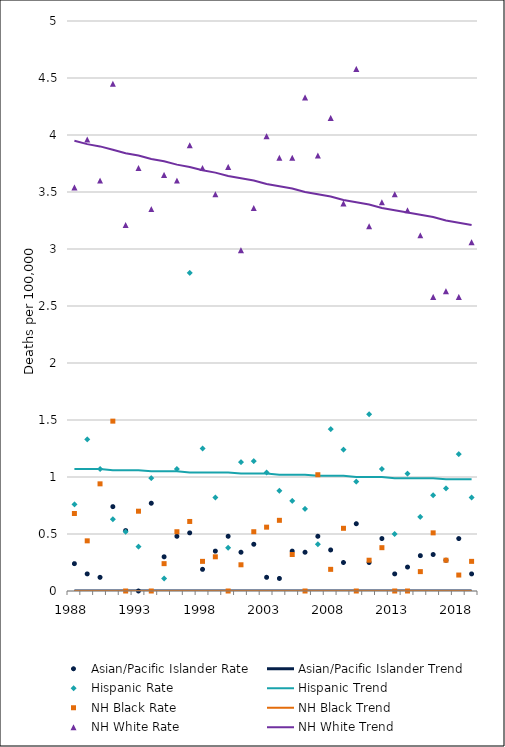
| Category | Asian/Pacific Islander Rate | Asian/Pacific Islander Trend | Hispanic Rate | Hispanic Trend | NH Black Rate | NH Black Trend | NH White Rate | NH White Trend |
|---|---|---|---|---|---|---|---|---|
| 1988.0 | 0.24 | 0 | 0.76 | 1.07 | 0.68 | 0 | 3.54 | 3.95 |
| 1989.0 | 0.15 | 0 | 1.33 | 1.07 | 0.44 | 0 | 3.96 | 3.92 |
| 1990.0 | 0.12 | 0 | 1.07 | 1.07 | 0.94 | 0 | 3.6 | 3.9 |
| 1991.0 | 0.74 | 0 | 0.63 | 1.06 | 1.49 | 0 | 4.45 | 3.87 |
| 1992.0 | 0.53 | 0 | 0.52 | 1.06 | 0 | 0 | 3.21 | 3.84 |
| 1993.0 | 0 | 0 | 0.39 | 1.06 | 0.7 | 0 | 3.71 | 3.82 |
| 1994.0 | 0.77 | 0 | 0.99 | 1.05 | 0 | 0 | 3.35 | 3.79 |
| 1995.0 | 0.3 | 0 | 0.11 | 1.05 | 0.24 | 0 | 3.65 | 3.77 |
| 1996.0 | 0.48 | 0 | 1.07 | 1.05 | 0.52 | 0 | 3.6 | 3.74 |
| 1997.0 | 0.51 | 0 | 2.79 | 1.04 | 0.61 | 0 | 3.91 | 3.72 |
| 1998.0 | 0.19 | 0 | 1.25 | 1.04 | 0.26 | 0 | 3.71 | 3.69 |
| 1999.0 | 0.35 | 0 | 0.82 | 1.04 | 0.3 | 0 | 3.48 | 3.67 |
| 2000.0 | 0.48 | 0 | 0.38 | 1.04 | 0 | 0 | 3.72 | 3.64 |
| 2001.0 | 0.34 | 0 | 1.13 | 1.03 | 0.23 | 0 | 2.99 | 3.62 |
| 2002.0 | 0.41 | 0 | 1.14 | 1.03 | 0.52 | 0 | 3.36 | 3.6 |
| 2003.0 | 0.12 | 0 | 1.04 | 1.03 | 0.56 | 0 | 3.99 | 3.57 |
| 2004.0 | 0.11 | 0 | 0.88 | 1.02 | 0.62 | 0 | 3.8 | 3.55 |
| 2005.0 | 0.35 | 0 | 0.79 | 1.02 | 0.32 | 0 | 3.8 | 3.53 |
| 2006.0 | 0.34 | 0 | 0.72 | 1.02 | 0 | 0 | 4.33 | 3.5 |
| 2007.0 | 0.48 | 0 | 0.41 | 1.01 | 1.02 | 0 | 3.82 | 3.48 |
| 2008.0 | 0.36 | 0 | 1.42 | 1.01 | 0.19 | 0 | 4.15 | 3.46 |
| 2009.0 | 0.25 | 0 | 1.24 | 1.01 | 0.55 | 0 | 3.4 | 3.43 |
| 2010.0 | 0.59 | 0 | 0.96 | 1 | 0 | 0 | 4.58 | 3.41 |
| 2011.0 | 0.25 | 0 | 1.55 | 1 | 0.27 | 0 | 3.2 | 3.39 |
| 2012.0 | 0.46 | 0 | 1.07 | 1 | 0.38 | 0 | 3.41 | 3.36 |
| 2013.0 | 0.15 | 0 | 0.5 | 0.99 | 0 | 0 | 3.48 | 3.34 |
| 2014.0 | 0.21 | 0 | 1.03 | 0.99 | 0 | 0 | 3.34 | 3.32 |
| 2015.0 | 0.31 | 0 | 0.65 | 0.99 | 0.17 | 0 | 3.12 | 3.3 |
| 2016.0 | 0.32 | 0 | 0.84 | 0.99 | 0.51 | 0 | 2.58 | 3.28 |
| 2017.0 | 0.27 | 0 | 0.9 | 0.98 | 0.27 | 0 | 2.63 | 3.25 |
| 2018.0 | 0.46 | 0 | 1.2 | 0.98 | 0.14 | 0 | 2.58 | 3.23 |
| 2019.0 | 0.15 | 0 | 0.82 | 0.98 | 0.26 | 0 | 3.06 | 3.21 |